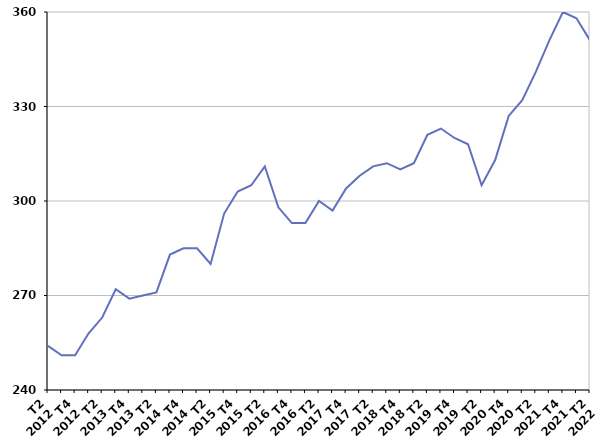
| Category | Durée moyenne d'inscription sur les listes des sortants |
|---|---|
| T2
2012 | 254 |
| T3
2012 | 251 |
| T4
2012 | 251 |
| T1
2013 | 258 |
| T2
2013 | 263 |
| T3
2013 | 272 |
| T4
2013 | 269 |
| T1
2014 | 270 |
| T2
2014 | 271 |
| T3
2014 | 283 |
| T4
2014 | 285 |
| T1
2015 | 285 |
| T2
2015 | 280 |
| T3
2015 | 296 |
| T4
2015 | 303 |
| T1
2016 | 305 |
| T2
2016 | 311 |
| T3
2016 | 298 |
| T4
2016 | 293 |
| T1
2017 | 293 |
| T2
2017 | 300 |
| T3
2017 | 297 |
| T4
2017 | 304 |
| T1
2018 | 308 |
| T2
2018 | 311 |
| T3
2018 | 312 |
| T4
2018 | 310 |
| T1
2019 | 312 |
| T2
2019 | 321 |
| T3
2019 | 323 |
| T4
2019 | 320 |
| T1
2020 | 318 |
| T2
2020 | 305 |
| T3
2020 | 313 |
| T4
2020 | 327 |
| T1
2021 | 332 |
| T2
2021 | 341 |
| T3
2021 | 351 |
| T4
2021 | 360 |
| T1
2022 | 358 |
| T2
2022 | 351 |